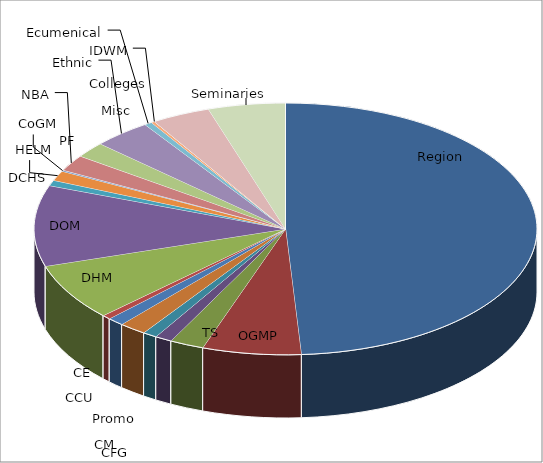
| Category | Series 0 |
|---|---|
| Region | 0.49 |
| OGMP | 0.063 |
| TS | 0.022 |
| Promo | 0.011 |
| CFG | 0.009 |
| CM | 0.018 |
| CCU | 0.011 |
| CE | 0.006 |
| DHM | 0.073 |
| DOM | 0.104 |
| DCHS | 0.007 |
| HELM | 0.013 |
| CoGM | 0.002 |
| NBA | 0.021 |
| PF | 0.02 |
| Ethnic | 0.037 |
| Ecumenical | 0.005 |
| Misc | 0.002 |
| IDWM | 0 |
| Colleges | 0.038 |
| Seminaries | 0.05 |